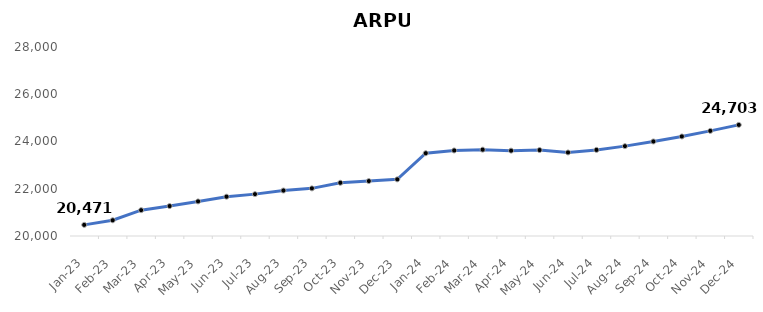
| Category | ARPU |
|---|---|
| 2023-01-31 | 20471.199 |
| 2023-02-28 | 20666.31 |
| 2023-03-31 | 21093.354 |
| 2023-04-30 | 21267.01 |
| 2023-05-31 | 21464.516 |
| 2023-06-30 | 21663.957 |
| 2023-07-31 | 21772.457 |
| 2023-08-31 | 21924.865 |
| 2023-09-30 | 22016.08 |
| 2023-10-31 | 22252.699 |
| 2023-11-30 | 22325.621 |
| 2023-12-31 | 22397.812 |
| 2024-01-31 | 23504.151 |
| 2024-02-29 | 23620.537 |
| 2024-03-31 | 23654.257 |
| 2024-04-30 | 23612.497 |
| 2024-05-31 | 23637.833 |
| 2024-06-30 | 23536.105 |
| 2024-07-31 | 23644.428 |
| 2024-08-31 | 23803.57 |
| 2024-09-30 | 24001.067 |
| 2024-10-31 | 24213.592 |
| 2024-11-30 | 24449.337 |
| 2024-12-31 | 24703.372 |